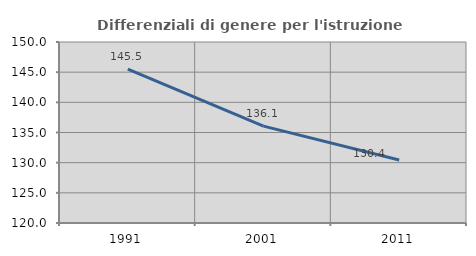
| Category | Differenziali di genere per l'istruzione superiore |
|---|---|
| 1991.0 | 145.485 |
| 2001.0 | 136.058 |
| 2011.0 | 130.435 |